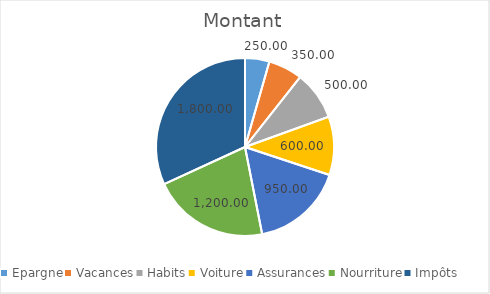
| Category | Montant |
|---|---|
| Epargne | 250 |
| Vacances | 350 |
| Habits | 500 |
| Voiture | 600 |
| Assurances | 950 |
| Nourriture | 1200 |
| Impôts | 1800 |